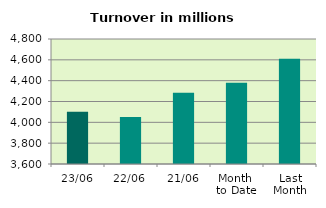
| Category | Series 0 |
|---|---|
| 23/06 | 4101.39 |
| 22/06 | 4050.37 |
| 21/06 | 4283.982 |
| Month 
to Date | 4379.356 |
| Last
Month | 4609.327 |